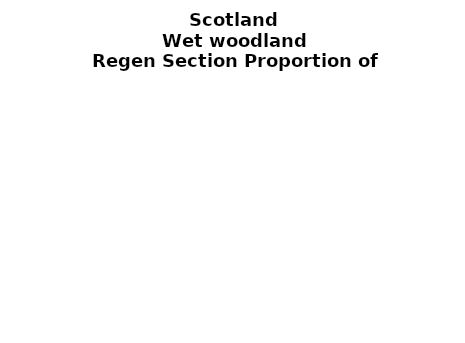
| Category | Wet woodland |
|---|---|
| None | 0.08 |
| Seedlings only | 0 |
| Seedlings, saplings only | 0.039 |
| Seedlings, saplings, <7 cm trees | 0.072 |
| Saplings only | 0.333 |
| <7 cm trees, seedlings only | 0 |
| <7 cm trees, saplings only | 0.365 |
| <7 cm Trees only | 0.112 |